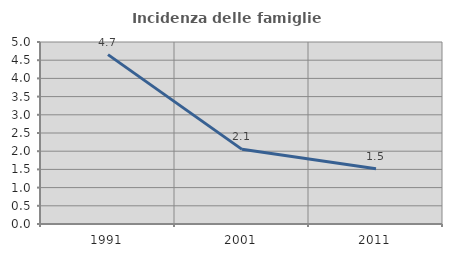
| Category | Incidenza delle famiglie numerose |
|---|---|
| 1991.0 | 4.653 |
| 2001.0 | 2.051 |
| 2011.0 | 1.515 |